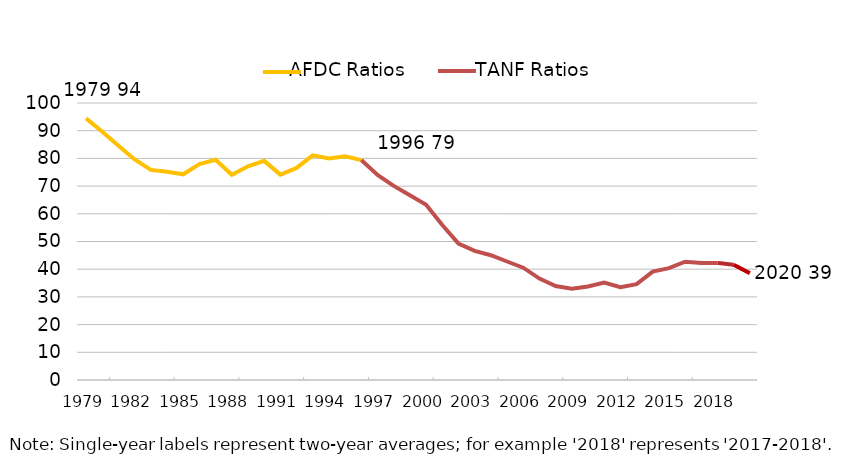
| Category | New York |
|---|---|
| 1979.0 | 94.435 |
| 1980.0 | 89.639 |
| 1981.0 | 84.567 |
| 1982.0 | 79.607 |
| 1983.0 | 75.85 |
| 1984.0 | 75.207 |
| 1985.0 | 74.257 |
| 1986.0 | 77.92 |
| 1987.0 | 79.487 |
| 1988.0 | 74.113 |
| 1989.0 | 77.168 |
| 1990.0 | 79.113 |
| 1991.0 | 74.161 |
| 1992.0 | 76.556 |
| 1993.0 | 81.102 |
| 1994.0 | 79.935 |
| 1995.0 | 80.725 |
| 1996.0 | 79.391 |
| 1997.0 | 73.994 |
| 1998.0 | 70.086 |
| 1999.0 | 66.699 |
| 2000.0 | 63.288 |
| 2001.0 | 55.928 |
| 2002.0 | 49.25 |
| 2003.0 | 46.629 |
| 2004.0 | 45.043 |
| 2005.0 | 42.781 |
| 2006.0 | 40.536 |
| 2007.0 | 36.603 |
| 2008.0 | 33.93 |
| 2009.0 | 32.987 |
| 2010.0 | 33.755 |
| 2011.0 | 35.18 |
| 2012.0 | 33.5 |
| 2013.0 | 34.619 |
| 2014.0 | 39.122 |
| 2015.0 | 40.381 |
| 2016.0 | 42.689 |
| 2017.0 | 42.218 |
| 2018.0 | 42.271 |
| 2019.0 | 41.599 |
| 2020.0 | 38.537 |